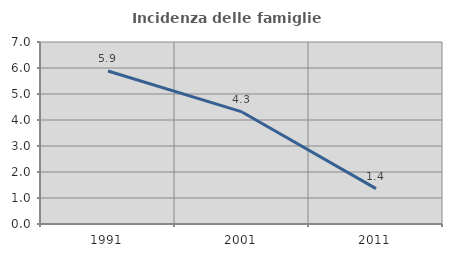
| Category | Incidenza delle famiglie numerose |
|---|---|
| 1991.0 | 5.882 |
| 2001.0 | 4.31 |
| 2011.0 | 1.361 |